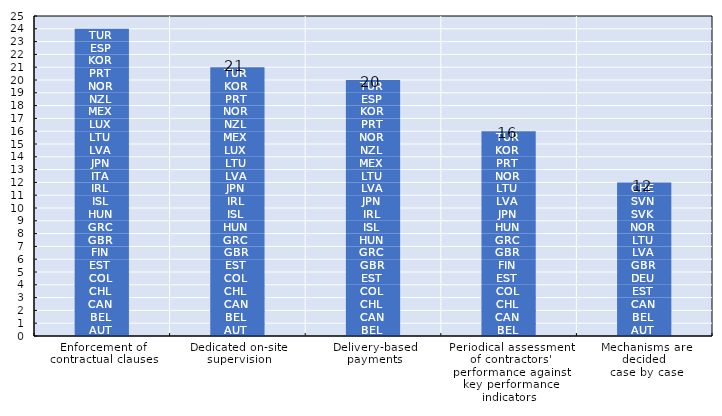
| Category | AUT | BEL | CAN | CHL | COL | CZE | EST | FIN | DEU | GBR | GRC | HUN | ISL | IRL | ITA | JPN | LVA | LTU | LUX | MEX | NZL | NOR | PRT | KOR | SVK | SVN | ESP | CHE | TUR | USA |
|---|---|---|---|---|---|---|---|---|---|---|---|---|---|---|---|---|---|---|---|---|---|---|---|---|---|---|---|---|---|---|
| Enforcement of contractual clauses | 1 | 1 | 1 | 1 | 1 | 0 | 1 | 1 | 0 | 1 | 1 | 1 | 1 | 1 | 1 | 1 | 1 | 1 | 1 | 1 | 1 | 1 | 1 | 1 | 0 | 0 | 1 | 0 | 1 | 0 |
| Dedicated on-site supervision | 1 | 1 | 1 | 1 | 1 | 0 | 1 | 0 | 0 | 1 | 1 | 1 | 1 | 1 | 0 | 1 | 1 | 1 | 1 | 1 | 1 | 1 | 1 | 1 | 0 | 0 | 0 | 0 | 1 | 0 |
| Delivery-based payments | 0 | 1 | 1 | 1 | 1 | 0 | 1 | 0 | 0 | 1 | 1 | 1 | 1 | 1 | 0 | 1 | 1 | 1 | 0 | 1 | 1 | 1 | 1 | 1 | 0 | 0 | 1 | 0 | 1 | 0 |
| Periodical assessment of contractors' performance against key performance indicators | 0 | 1 | 1 | 1 | 1 | 0 | 1 | 1 | 0 | 1 | 1 | 1 | 0 | 0 | 0 | 1 | 1 | 1 | 0 | 0 | 0 | 1 | 1 | 1 | 0 | 0 | 0 | 0 | 1 | 0 |
| Mechanisms are decided 
case by case | 1 | 1 | 1 | 0 | 0 | 0 | 1 | 0 | 1 | 1 | 0 | 0 | 0 | 0 | 0 | 0 | 1 | 1 | 0 | 0 | 0 | 1 | 0 | 0 | 1 | 1 | 0 | 1 | 0 | 0 |